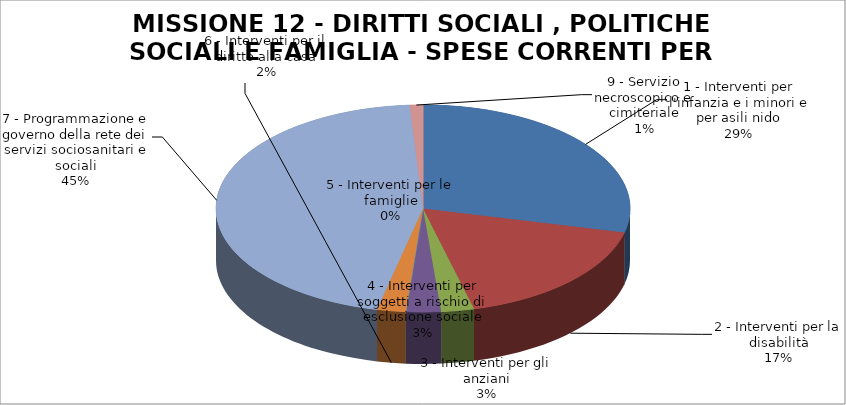
| Category | Series 0 |
|---|---|
| 1 - Interventi per l'infanzia e i minori e per asili nido | 2963527 |
| 2 - Interventi per la disabilità | 1783721 |
| 3 - Interventi per gli anziani | 264344 |
| 4 - Interventi per soggetti a rischio di esclusione sociale | 279354 |
| 5 - Interventi per le famiglie | 0 |
| 6 - Interventi per il diritto alla casa | 231675 |
| 7 - Programmazione e governo della rete dei servizi sociosanitari e sociali | 4682106 |
| 9 - Servizio necroscopico e cimiteriale | 106000 |